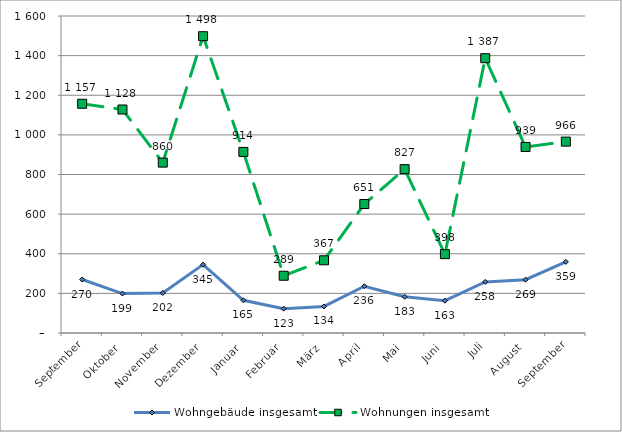
| Category | Wohngebäude insgesamt | Wohnungen insgesamt |
|---|---|---|
| September | 270 | 1157 |
| Oktober | 199 | 1128 |
| November | 202 | 860 |
| Dezember | 345 | 1498 |
| Januar | 165 | 914 |
| Februar | 123 | 289 |
| März | 134 | 367 |
| April | 236 | 651 |
| Mai | 183 | 827 |
| Juni | 163 | 398 |
| Juli | 258 | 1387 |
| August | 269 | 939 |
| September | 359 | 966 |